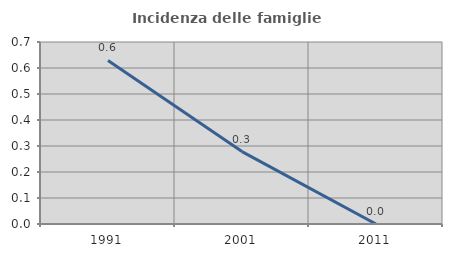
| Category | Incidenza delle famiglie numerose |
|---|---|
| 1991.0 | 0.629 |
| 2001.0 | 0.279 |
| 2011.0 | 0 |